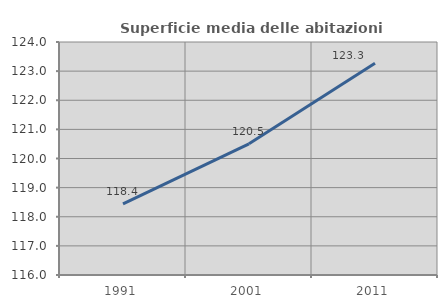
| Category | Superficie media delle abitazioni occupate |
|---|---|
| 1991.0 | 118.442 |
| 2001.0 | 120.504 |
| 2011.0 | 123.269 |